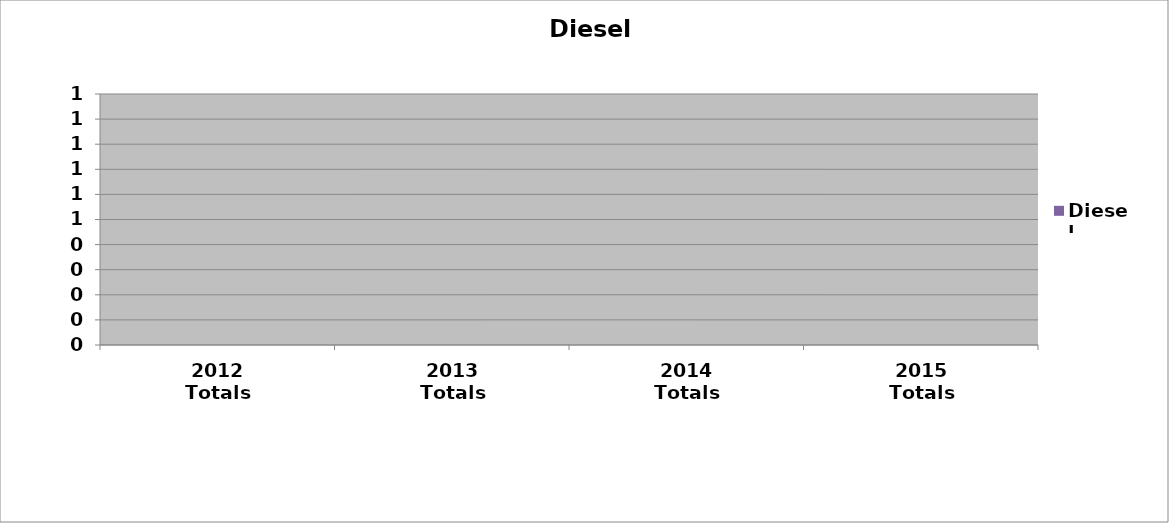
| Category | Diesel |
|---|---|
| 2012 Totals | 0 |
| 2013 Totals | 0 |
| 2014 Totals | 0 |
| 2015 Totals | 0 |